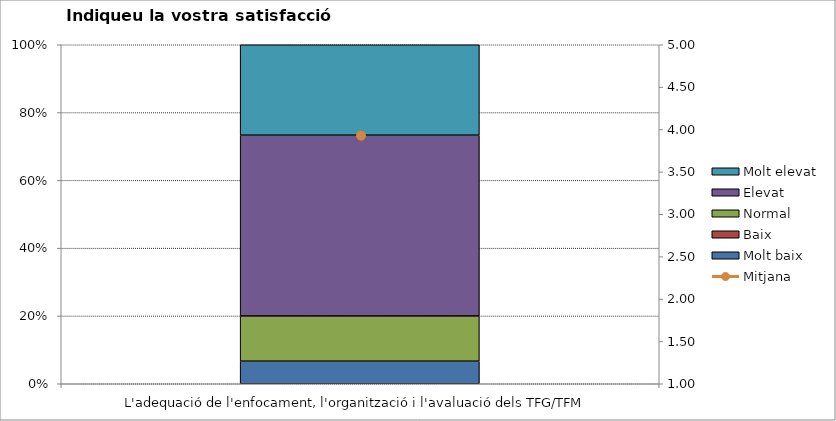
| Category | Molt baix | Baix | Normal  | Elevat | Molt elevat |
|---|---|---|---|---|---|
| L'adequació de l'enfocament, l'organització i l'avaluació dels TFG/TFM | 1 | 0 | 2 | 8 | 4 |